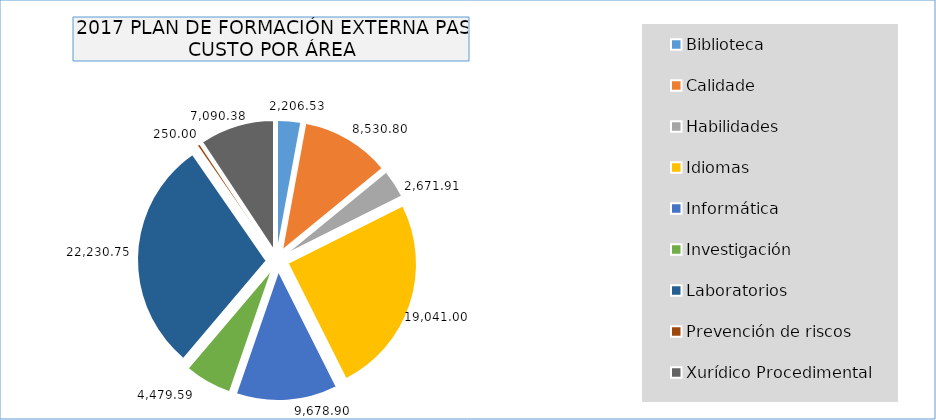
| Category | Series 0 |
|---|---|
| Biblioteca | 2206.53 |
| Calidade | 8530.8 |
| Habilidades | 2671.91 |
| Idiomas | 19041 |
| Informática | 9678.9 |
| Investigación | 4479.59 |
| Laboratorios | 22230.75 |
| Prevención de riscos | 250 |
| Xurídico Procedimental | 7090.38 |